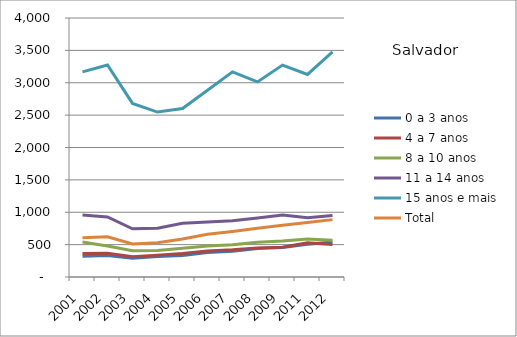
| Category | 0 a 3 anos | 4 a 7 anos | 8 a 10 anos | 11 a 14 anos | 15 anos e mais | Total |
|---|---|---|---|---|---|---|
| 2001.0 | 320.97 | 363.49 | 539.18 | 958.68 | 3167.45 | 605.24 |
| 2002.0 | 332.91 | 367.76 | 478.28 | 928.11 | 3275.03 | 622.23 |
| 2003.0 | 290.58 | 311.36 | 404.42 | 745.09 | 2681.07 | 510.46 |
| 2004.0 | 316.99 | 337.88 | 409.06 | 751.93 | 2547.57 | 529.42 |
| 2005.0 | 330.5 | 364.26 | 444.85 | 830.1 | 2602.11 | 586.65 |
| 2006.0 | 379.31 | 401.94 | 477.89 | 850.52 | 2884.84 | 659.25 |
| 2007.0 | 396.58 | 420.01 | 499.03 | 869.53 | 3168.41 | 703.69 |
| 2008.0 | 439.26 | 449.83 | 538.01 | 912.56 | 3012.61 | 754.32 |
| 2009.0 | 456.96 | 459.94 | 555.12 | 958.07 | 3272.83 | 798.59 |
| 2011.0 | 505.18 | 527.84 | 586.12 | 915.93 | 3127.77 | 842.9 |
| 2012.0 | 541.43 | 501.53 | 569.22 | 949.58 | 3475.38 | 886.13 |